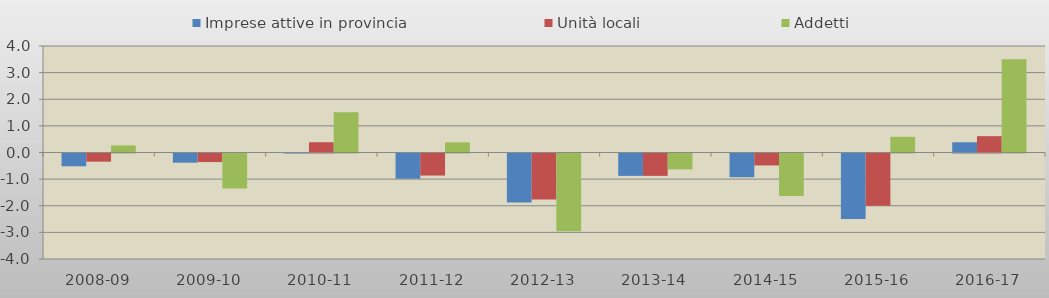
| Category | Imprese attive in provincia | Unità locali | Addetti |
|---|---|---|---|
| 2008-09 | -0.48 | -0.307 | 0.266 |
| 2009-10 | -0.345 | -0.322 | -1.311 |
| 2010-11 | -0.003 | 0.386 | 1.509 |
| 2011-12 | -0.947 | -0.828 | 0.382 |
| 2012-13 | -1.843 | -1.728 | -2.919 |
| 2013-14 | -0.841 | -0.84 | -0.596 |
| 2014-15 | -0.892 | -0.449 | -1.599 |
| 2015-16 | -2.464 | -1.963 | 0.588 |
| 2016-17 | 0.383 | 0.613 | 3.498 |